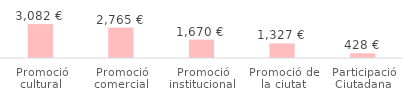
| Category | Total |
|---|---|
| Promoció cultural | 3081.87 |
| Promoció comercial | 2764.85 |
| Promoció institucional | 1669.8 |
| Promoció de la ciutat | 1327.37 |
| Participació Ciutadana | 427.74 |